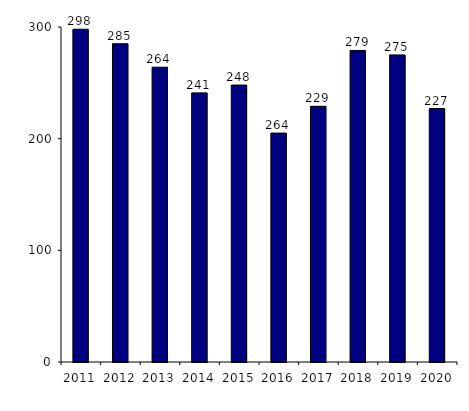
| Category | Nombre d'allogreffes |
|---|---|
| 2011.0 | 298 |
| 2012.0 | 285 |
| 2013.0 | 264 |
| 2014.0 | 241 |
| 2015.0 | 248 |
| 2016.0 | 205 |
| 2017.0 | 229 |
| 2018.0 | 279 |
| 2019.0 | 275 |
| 2020.0 | 227 |